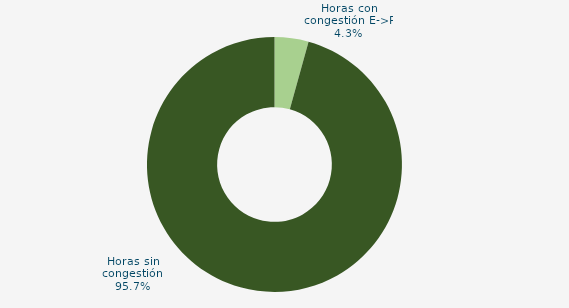
| Category | Horas con congestión E->P |
|---|---|
| Horas con congestión E->P | 4.306 |
| Horas con congestión P->E | 0 |
| Horas sin congestión | 95.694 |